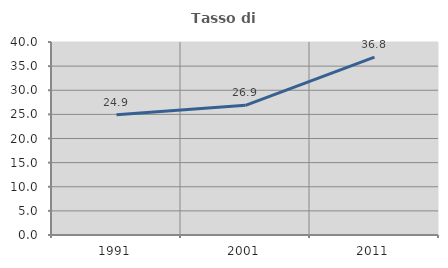
| Category | Tasso di occupazione   |
|---|---|
| 1991.0 | 24.923 |
| 2001.0 | 26.874 |
| 2011.0 | 36.847 |